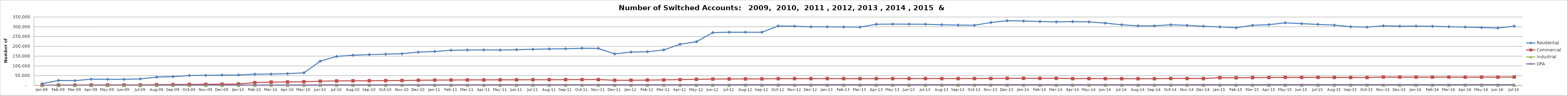
| Category | Residential | Commercial | Industrial | OPA |
|---|---|---|---|---|
| 2009-01-01 | 8808 | 850 | 113 | 232 |
| 2009-02-01 | 25588 | 2109 | 125 | 245 |
| 2009-03-01 | 24536 | 2067 | 125 | 241 |
| 2009-04-01 | 32007 | 2364 | 133 | 260 |
| 2009-05-01 | 31372 | 2560 | 142 | 263 |
| 2009-06-01 | 31167 | 2576 | 144 | 282 |
| 2009-07-01 | 33612 | 2734 | 160 | 291 |
| 2009-08-01 | 42728 | 3836 | 284 | 552 |
| 2009-09-01 | 44996 | 4323 | 356 | 773 |
| 2009-10-01 | 50953 | 5113 | 442 | 1369 |
| 2009-11-01 | 51594 | 5738 | 502 | 1538 |
| 2009-12-01 | 53015 | 6346 | 533 | 1612 |
| 2010-01-01 | 53371 | 7612 | 584 | 1686 |
| 2010-02-01 | 57604 | 14460 | 843 | 2026 |
| 2010-03-01 | 58189 | 16952 | 959 | 2169 |
| 2010-04-01 | 60301 | 17804 | 1016 | 2351 |
| 2010-05-01 | 64634 | 18892 | 1092 | 2420 |
| 2010-06-01 | 124233 | 21641 | 1155 | 2548 |
| 2010-07-01 | 148397 | 22987 | 1182 | 3092 |
| 2010-08-01 | 154636 | 23700 | 1209 | 3123 |
| 2010-09-01 | 157806 | 24154 | 1217 | 3124 |
| 2010-10-01 | 160089 | 24695 | 1236 | 3149 |
| 2010-11-01 | 162332 | 25396 | 1261 | 3164 |
| 2010-12-01 | 170444 | 26557 | 1285 | 3174 |
| 2011-01-01 | 173580 | 27301 | 1308 | 3169 |
| 2011-02-01 | 179843 | 27917 | 1313 | 3170 |
| 2011-03-01 | 181241 | 28163 | 1324 | 3171 |
| 2011-04-01 | 181864 | 28303 | 1327 | 3252 |
| 2011-05-01 | 180926 | 28655 | 1339 | 3282 |
| 2011-06-01 | 182906 | 28827 | 1337 | 3422 |
| 2011-07-01 | 184869 | 29064 | 1350 | 3468 |
| 2011-08-01 | 186634 | 29368 | 1356 | 3473 |
| 2011-09-01 | 187753 | 29765 | 1377 | 3482 |
| 2011-10-01 | 190084 | 29981 | 1396 | 3477 |
| 2011-11-01 | 189423 | 29976 | 1407 | 3631 |
| 2011-12-01 | 161581 | 26583 | 1319 | 3541 |
| 2012-01-01 | 170702 | 26751 | 1321 | 3501 |
| 2012-02-01 | 172450 | 27620 | 1357 | 3610 |
| 2012-03-01 | 181732 | 28229 | 1372 | 3640 |
| 2012-04-01 | 210624 | 29928 | 1421 | 3649 |
| 2012-05-01 | 223654 | 31294 | 1440 | 3663 |
| 2012-06-01 | 270367 | 32551 | 1469 | 3673 |
| 2012-07-01 | 272370 | 32950 | 1484 | 3680 |
| 2012-08-01 | 272292 | 33332 | 1501 | 3706 |
| 2012-09-01 | 272256 | 33724 | 1504 | 3719 |
| 2012-10-01 | 304067 | 34612 | 1509 | 3737 |
| 2012-11-01 | 302881 | 34864 | 1529 | 3685 |
| 2012-12-01 | 300011 | 34890 | 1538 | 3767 |
| 2013-01-01 | 299791 | 35139 | 1537 | 3782 |
| 2013-02-01 | 299226 | 34990 | 1531 | 3778 |
| 2013-03-01 | 298499 | 34810 | 1532 | 3752 |
| 2013-04-01 | 312882 | 34949 | 1531 | 3745 |
| 2013-05-01 | 313781 | 35089 | 1536 | 3747 |
| 2013-06-01 | 313599 | 35269 | 1538 | 3751 |
| 2013-07-01 | 313038 | 35236 | 1549 | 3738 |
| 2013-08-01 | 310333 | 35227 | 1547 | 3750 |
| 2013-09-01 | 308581 | 35255 | 1544 | 3749 |
| 2013-10-01 | 307891 | 35246 | 1542 | 3749 |
| 2013-11-01 | 321895 | 35514 | 1551 | 3762 |
| 2013-12-01 | 331119 | 36319 | 1559 | 3722 |
| 2014-01-01 | 329556 | 36530 | 1555 | 3712 |
| 2014-02-01 | 326912 | 36240 | 1552 | 3522 |
| 2014-03-01 | 325005 | 36351 | 1551 | 3539 |
| 2014-04-01 | 326558 | 35011 | 1520 | 3480 |
| 2014-05-01 | 324973 | 35122 | 1517 | 3507 |
| 2014-06-01 | 318593 | 34819 | 1494 | 3498 |
| 2014-07-01 | 310499 | 34617 | 1498 | 3497 |
| 2014-08-01 | 304632 | 34368 | 1493 | 3485 |
| 2014-09-01 | 304632 | 34368 | 1493 | 3485 |
| 2014-10-01 | 310234 | 35536 | 1525 | 3532 |
| 2014-11-01 | 307511 | 35502 | 1521 | 3653 |
| 2014-12-01 | 302699 | 35218 | 1505 | 3716 |
| 2015-01-01 | 299350 | 39503 | 1501 | 3656 |
| 2015-02-01 | 295095 | 39113 | 1482 | 3651 |
| 2015-03-01 | 307599 | 40238 | 1505 | 3677 |
| 2015-04-01 | 310944 | 40565 | 1508 | 3783 |
| 2015-05-01 | 320395 | 41228 | 1507 | 3809 |
| 2015-06-01 | 316010 | 41007 | 1507 | 3805 |
| 2015-07-01 | 312086 | 41230 | 1519 | 3815 |
| 2015-08-01 | 308446 | 41097 | 1521 | 3806 |
| 2015-09-01 | 300467 | 40706 | 1516 | 3811 |
| 2015-10-01 | 298053 | 40574 | 1521 | 3813 |
| 2015-11-01 | 304983 | 42953 | 1579 | 3831 |
| 2015-12-01 | 302831 | 42695 | 1577 | 3830 |
| 2016-01-01 | 303615 | 42564 | 1575 | 3836 |
| 2016-02-01 | 302345 | 42541 | 1573 | 3877 |
| 2016-03-01 | 300521 | 42545 | 1572 | 3907 |
| 2016-04-01 | 298656 | 42428 | 1572 | 3924 |
| 2016-05-01 | 296233 | 42559 | 1579 | 3941 |
| 2016-06-01 | 293653 | 42517 | 1572 | 3943 |
| 2016-07-01 | 302912 | 43066 | 1580 | 3959 |